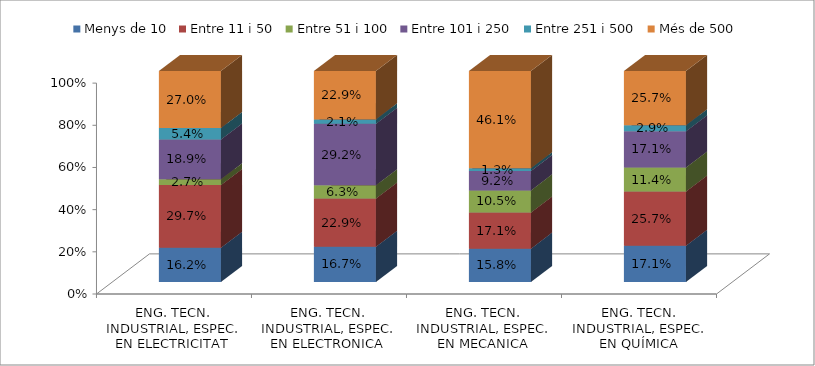
| Category | Menys de 10 | Entre 11 i 50 | Entre 51 i 100 | Entre 101 i 250 | Entre 251 i 500 | Més de 500 |
|---|---|---|---|---|---|---|
| ENG. TECN. INDUSTRIAL, ESPEC. EN ELECTRICITAT | 0.162 | 0.297 | 0.027 | 0.189 | 0.054 | 0.27 |
| ENG. TECN. INDUSTRIAL, ESPEC. EN ELECTRONICA INDUSTRIAL | 0.167 | 0.229 | 0.062 | 0.292 | 0.021 | 0.229 |
| ENG. TECN. INDUSTRIAL, ESPEC. EN MECANICA | 0.158 | 0.171 | 0.105 | 0.092 | 0.013 | 0.461 |
| ENG. TECN. INDUSTRIAL, ESPEC. EN QUÍMICA INDUSTRIAL | 0.171 | 0.257 | 0.114 | 0.171 | 0.029 | 0.257 |